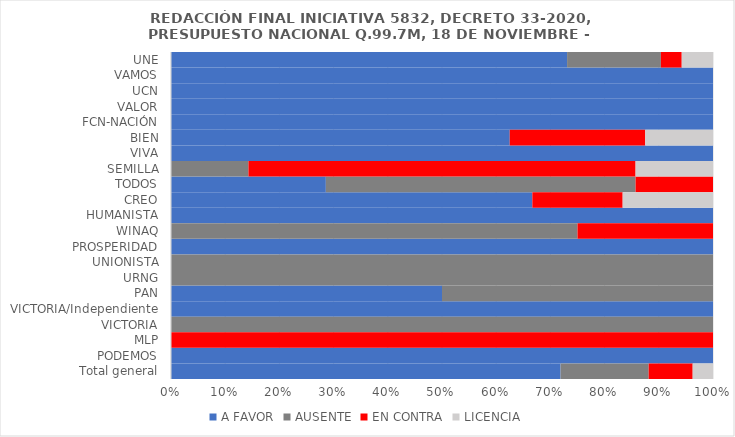
| Category | A FAVOR | AUSENTE | EN CONTRA | LICENCIA |
|---|---|---|---|---|
| UNE | 0.731 | 0.173 | 0.038 | 0.058 |
| VAMOS | 1 | 0 | 0 | 0 |
| UCN | 1 | 0 | 0 | 0 |
| VALOR | 1 | 0 | 0 | 0 |
| FCN-NACIÓN | 1 | 0 | 0 | 0 |
| BIEN | 0.625 | 0 | 0.25 | 0.125 |
| VIVA | 1 | 0 | 0 | 0 |
| SEMILLA | 0 | 0.143 | 0.714 | 0.143 |
| TODOS | 0.286 | 0.571 | 0.143 | 0 |
| CREO | 0.667 | 0 | 0.167 | 0.167 |
| HUMANISTA | 1 | 0 | 0 | 0 |
| WINAQ | 0 | 0.75 | 0.25 | 0 |
| PROSPERIDAD | 1 | 0 | 0 | 0 |
| UNIONISTA | 0 | 1 | 0 | 0 |
| URNG | 0 | 1 | 0 | 0 |
| PAN | 0.5 | 0.5 | 0 | 0 |
| VICTORIA/Independiente | 1 | 0 | 0 | 0 |
| VICTORIA | 0 | 1 | 0 | 0 |
| MLP | 0 | 0 | 1 | 0 |
| PODEMOS | 1 | 0 | 0 | 0 |
| Total general | 0.719 | 0.162 | 0.081 | 0.038 |